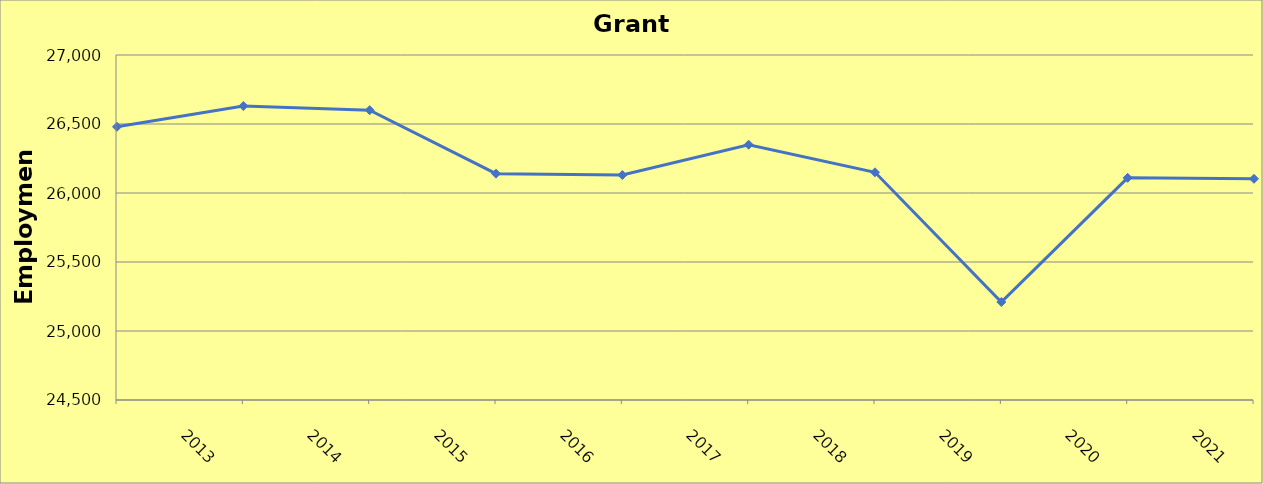
| Category | Grant County |
|---|---|
| 2013.0 | 26480 |
| 2014.0 | 26630 |
| 2015.0 | 26600 |
| 2016.0 | 26140 |
| 2017.0 | 26130 |
| 2018.0 | 26350 |
| 2019.0 | 26150 |
| 2020.0 | 25210 |
| 2021.0 | 26110 |
| 2022.0 | 26103 |